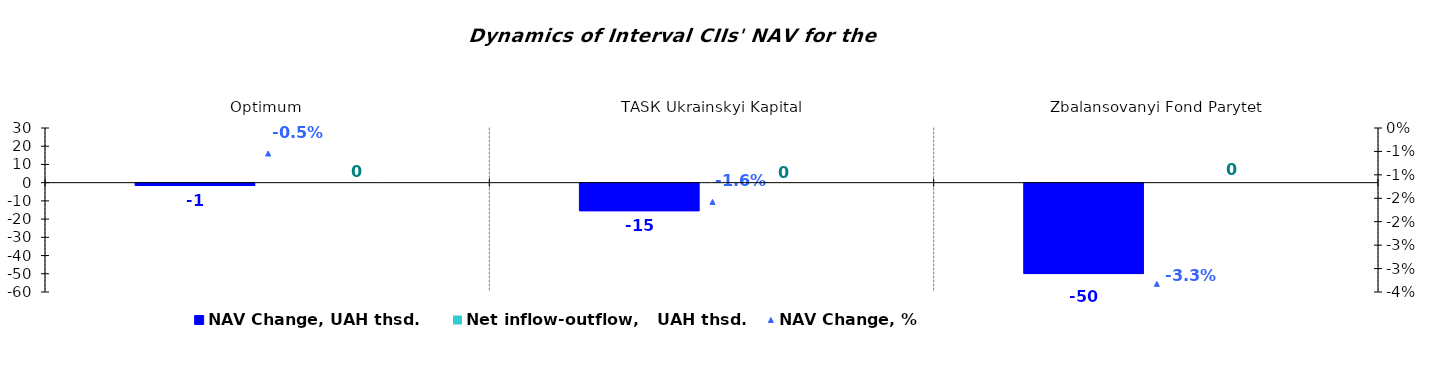
| Category | NAV Change, UAH thsd. | Net inflow-outflow,   UAH thsd. |
|---|---|---|
| Оptimum | -1.266 | 0 |
| ТАSК Ukrainskyi Kapital | -15.102 | 0 |
| Zbalansovanyi Fond Parytet | -49.614 | 0 |